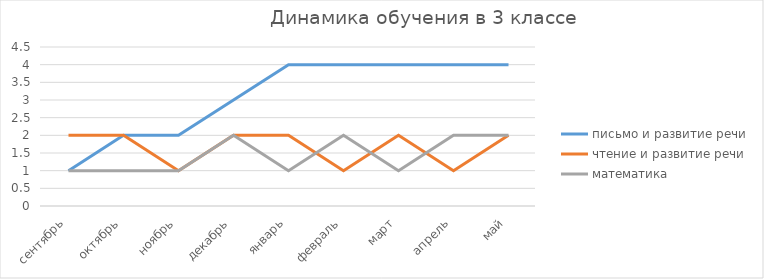
| Category | письмо и развитие речи | чтение и развитие речи | математика |
|---|---|---|---|
| сентябрь | 1 | 2 | 1 |
| октябрь | 2 | 2 | 1 |
| ноябрь | 2 | 1 | 1 |
| декабрь | 3 | 2 | 2 |
| январь | 4 | 2 | 1 |
| февраль | 4 | 1 | 2 |
| март | 4 | 2 | 1 |
| апрель | 4 | 1 | 2 |
| май | 4 | 2 | 2 |